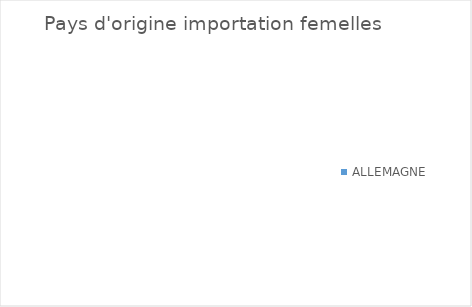
| Category | Series 0 |
|---|---|
| ALLEMAGNE | 0 |